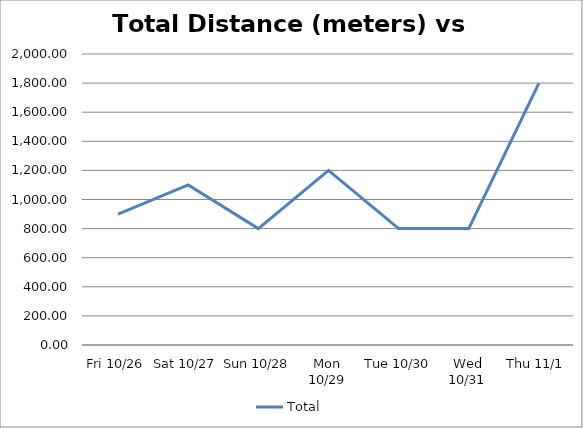
| Category | Total |
|---|---|
| Fri 10/26 | 900 |
| Sat 10/27 | 1100 |
| Sun 10/28 | 800 |
| Mon 10/29 | 1200 |
| Tue 10/30 | 800 |
| Wed 10/31 | 800 |
| Thu 11/1 | 1800 |